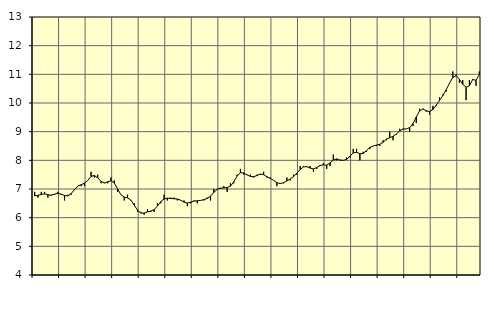
| Category | Piggar | Offentlig förvaltning m.m., SNI 84, 99 |
|---|---|---|
| nan | 6.9 | 6.76 |
| 87.0 | 6.7 | 6.78 |
| 87.0 | 6.9 | 6.81 |
| 87.0 | 6.9 | 6.83 |
| nan | 6.7 | 6.8 |
| 88.0 | 6.8 | 6.78 |
| 88.0 | 6.8 | 6.82 |
| 88.0 | 6.9 | 6.85 |
| nan | 6.8 | 6.82 |
| 89.0 | 6.6 | 6.77 |
| 89.0 | 6.8 | 6.76 |
| 89.0 | 6.8 | 6.84 |
| nan | 7 | 6.98 |
| 90.0 | 7.1 | 7.1 |
| 90.0 | 7.1 | 7.15 |
| 90.0 | 7.1 | 7.2 |
| nan | 7.3 | 7.3 |
| 91.0 | 7.6 | 7.44 |
| 91.0 | 7.4 | 7.47 |
| 91.0 | 7.5 | 7.39 |
| nan | 7.2 | 7.27 |
| 92.0 | 7.2 | 7.21 |
| 92.0 | 7.2 | 7.25 |
| 92.0 | 7.4 | 7.29 |
| nan | 7.3 | 7.21 |
| 93.0 | 6.9 | 7 |
| 93.0 | 6.8 | 6.8 |
| 93.0 | 6.6 | 6.72 |
| nan | 6.8 | 6.69 |
| 94.0 | 6.6 | 6.61 |
| 94.0 | 6.5 | 6.44 |
| 94.0 | 6.2 | 6.26 |
| nan | 6.2 | 6.16 |
| 95.0 | 6.1 | 6.16 |
| 95.0 | 6.3 | 6.2 |
| 95.0 | 6.2 | 6.23 |
| nan | 6.2 | 6.28 |
| 96.0 | 6.5 | 6.41 |
| 96.0 | 6.5 | 6.56 |
| 96.0 | 6.8 | 6.65 |
| nan | 6.6 | 6.68 |
| 97.0 | 6.7 | 6.67 |
| 97.0 | 6.7 | 6.66 |
| 97.0 | 6.6 | 6.65 |
| nan | 6.6 | 6.61 |
| 98.0 | 6.6 | 6.54 |
| 98.0 | 6.4 | 6.51 |
| 98.0 | 6.5 | 6.54 |
| nan | 6.6 | 6.58 |
| 99.0 | 6.5 | 6.59 |
| 99.0 | 6.6 | 6.6 |
| 99.0 | 6.6 | 6.63 |
| nan | 6.7 | 6.67 |
| 0.0 | 6.6 | 6.75 |
| 0.0 | 7 | 6.88 |
| 0.0 | 7 | 6.99 |
| nan | 7 | 7.03 |
| 1.0 | 7.1 | 7.04 |
| 1.0 | 6.9 | 7.05 |
| 1.0 | 7.2 | 7.1 |
| nan | 7.2 | 7.25 |
| 2.0 | 7.5 | 7.45 |
| 2.0 | 7.7 | 7.57 |
| 2.0 | 7.5 | 7.56 |
| nan | 7.5 | 7.49 |
| 3.0 | 7.5 | 7.44 |
| 3.0 | 7.4 | 7.43 |
| 3.0 | 7.5 | 7.47 |
| nan | 7.5 | 7.52 |
| 4.0 | 7.6 | 7.5 |
| 4.0 | 7.4 | 7.43 |
| 4.0 | 7.4 | 7.37 |
| nan | 7.3 | 7.3 |
| 5.0 | 7.1 | 7.22 |
| 5.0 | 7.2 | 7.19 |
| 5.0 | 7.2 | 7.22 |
| nan | 7.4 | 7.28 |
| 6.0 | 7.3 | 7.35 |
| 6.0 | 7.5 | 7.43 |
| 6.0 | 7.5 | 7.55 |
| nan | 7.8 | 7.68 |
| 7.0 | 7.8 | 7.77 |
| 7.0 | 7.8 | 7.78 |
| 7.0 | 7.8 | 7.73 |
| nan | 7.6 | 7.7 |
| 8.0 | 7.7 | 7.75 |
| 8.0 | 7.8 | 7.82 |
| 8.0 | 7.9 | 7.84 |
| nan | 7.7 | 7.83 |
| 9.0 | 7.8 | 7.91 |
| 9.0 | 8.2 | 8.01 |
| 9.0 | 8 | 8.05 |
| nan | 8 | 8.01 |
| 10.0 | 8 | 8 |
| 10.0 | 8.1 | 8.03 |
| 10.0 | 8.1 | 8.15 |
| nan | 8.4 | 8.26 |
| 11.0 | 8.4 | 8.28 |
| 11.0 | 8 | 8.23 |
| 11.0 | 8.3 | 8.24 |
| nan | 8.3 | 8.34 |
| 12.0 | 8.4 | 8.45 |
| 12.0 | 8.5 | 8.5 |
| 12.0 | 8.5 | 8.53 |
| nan | 8.5 | 8.56 |
| 13.0 | 8.7 | 8.63 |
| 13.0 | 8.7 | 8.74 |
| 13.0 | 9 | 8.79 |
| nan | 8.7 | 8.84 |
| 14.0 | 8.9 | 8.92 |
| 14.0 | 9.1 | 9.03 |
| 14.0 | 9.1 | 9.09 |
| nan | 9.1 | 9.1 |
| 15.0 | 9 | 9.14 |
| 15.0 | 9.2 | 9.28 |
| 15.0 | 9.3 | 9.51 |
| nan | 9.8 | 9.73 |
| 16.0 | 9.8 | 9.79 |
| 16.0 | 9.7 | 9.73 |
| 16.0 | 9.6 | 9.7 |
| nan | 9.9 | 9.77 |
| 17.0 | 9.9 | 9.92 |
| 17.0 | 10.2 | 10.09 |
| 17.0 | 10.3 | 10.26 |
| nan | 10.4 | 10.46 |
| 18.0 | 10.7 | 10.69 |
| 18.0 | 11.1 | 10.89 |
| 18.0 | 11 | 10.95 |
| nan | 10.7 | 10.83 |
| 19.0 | 10.8 | 10.65 |
| 19.0 | 10.1 | 10.55 |
| 19.0 | 10.8 | 10.6 |
| nan | 10.8 | 10.82 |
| 20.0 | 10.6 | 10.79 |
| 20.0 | 11.1 | 10.99 |